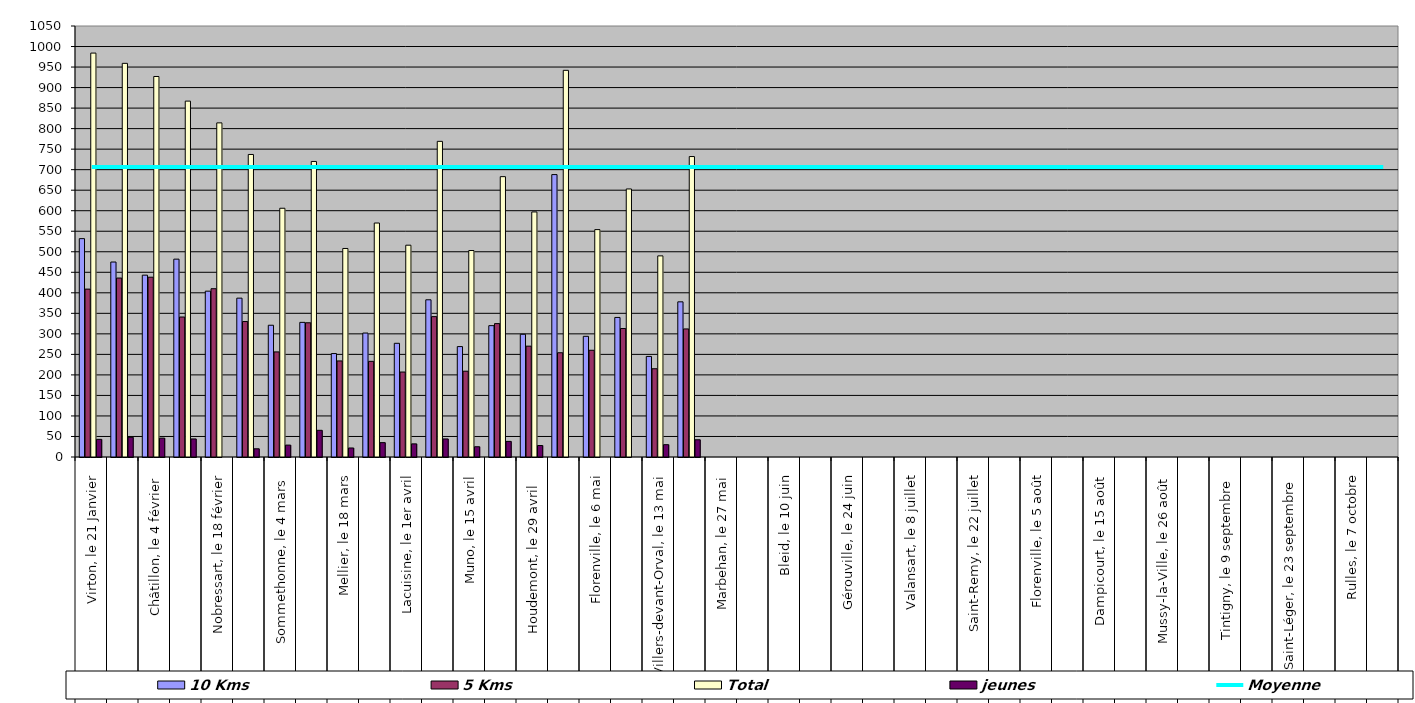
| Category | 10 Kms | 5 Kms | Total | jeunes |
|---|---|---|---|---|
| 0 | 532 | 409 | 984 | 43 |
| 1 | 475 | 436 | 959 | 48 |
| 2 | 443 | 438 | 927 | 46 |
| 3 | 482 | 341 | 867 | 44 |
| 4 | 404 | 410 | 814 | 0 |
| 5 | 387 | 330 | 737 | 20 |
| 6 | 321 | 256 | 606 | 29 |
| 7 | 328 | 327 | 720 | 65 |
| 8 | 252 | 234 | 508 | 22 |
| 9 | 302 | 233 | 570 | 35 |
| 10 | 277 | 207 | 516 | 32 |
| 11 | 383 | 342 | 769 | 44 |
| 12 | 269 | 209 | 503 | 25 |
| 13 | 320 | 325 | 683 | 38 |
| 14 | 299 | 270 | 597 | 28 |
| 15 | 688 | 254 | 942 | 0 |
| 16 | 294 | 260 | 554 | 0 |
| 17 | 340 | 313 | 653 | 0 |
| 18 | 245 | 215 | 490 | 30 |
| 19 | 378 | 312 | 732 | 42 |
| 20 | 0 | 0 | 0 | 0 |
| 21 | 0 | 0 | 0 | 0 |
| 22 | 0 | 0 | 0 | 0 |
| 23 | 0 | 0 | 0 | 0 |
| 24 | 0 | 0 | 0 | 0 |
| 25 | 0 | 0 | 0 | 0 |
| 26 | 0 | 0 | 0 | 0 |
| 27 | 0 | 0 | 0 | 0 |
| 28 | 0 | 0 | 0 | 0 |
| 29 | 0 | 0 | 0 | 0 |
| 30 | 0 | 0 | 0 | 0 |
| 31 | 0 | 0 | 0 | 0 |
| 32 | 0 | 0 | 0 | 0 |
| 33 | 0 | 0 | 0 | 0 |
| 34 | 0 | 0 | 0 | 0 |
| 35 | 0 | 0 | 0 | 0 |
| 36 | 0 | 0 | 0 | 0 |
| 37 | 0 | 0 | 0 | 0 |
| 38 | 0 | 0 | 0 | 0 |
| 39 | 0 | 0 | 0 | 0 |
| 40 | 0 | 0 | 0 | 0 |
| 41 | 0 | 0 | 0 | 0 |